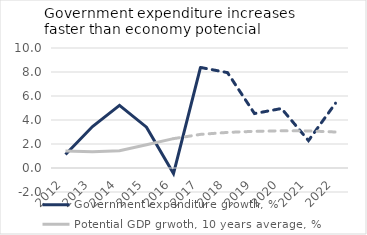
| Category | Government expenditure growth, % | Potential GDP grwoth, 10 years average, % |
|---|---|---|
| 2012 | 1.127 | 1.41 |
| 2013 | 3.456 | 1.359 |
| 2014 | 5.221 | 1.439 |
| 2015 | 3.403 | 1.938 |
| 2016 | -0.463 | 2.446 |
| 2017 | 8.379 | 2.802 |
| 2018 | 7.948 | 2.966 |
| 2019 | 4.537 | 3.055 |
| 2020 | 4.957 | 3.1 |
| 2021 | 2.282 | 3.091 |
| 2022 | 5.4 | 3 |